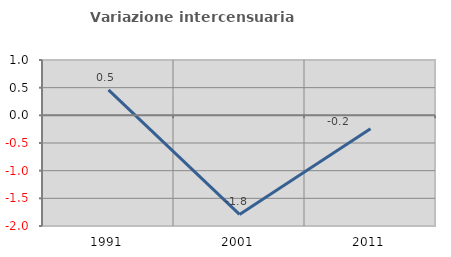
| Category | Variazione intercensuaria annua |
|---|---|
| 1991.0 | 0.461 |
| 2001.0 | -1.791 |
| 2011.0 | -0.243 |